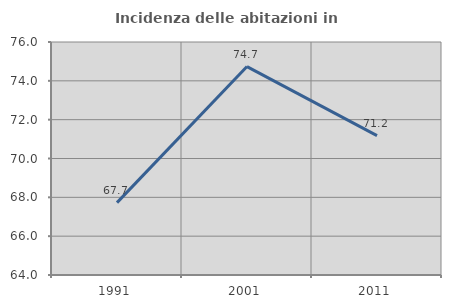
| Category | Incidenza delle abitazioni in proprietà  |
|---|---|
| 1991.0 | 67.729 |
| 2001.0 | 74.735 |
| 2011.0 | 71.181 |